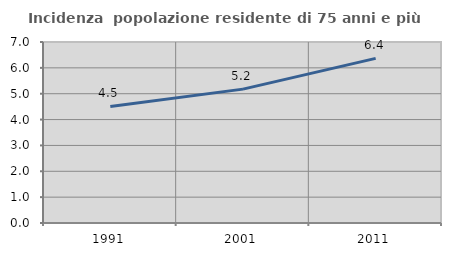
| Category | Incidenza  popolazione residente di 75 anni e più |
|---|---|
| 1991.0 | 4.506 |
| 2001.0 | 5.178 |
| 2011.0 | 6.366 |